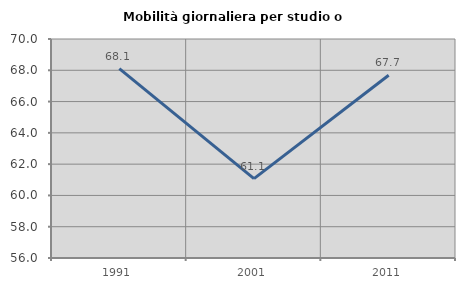
| Category | Mobilità giornaliera per studio o lavoro |
|---|---|
| 1991.0 | 68.109 |
| 2001.0 | 61.074 |
| 2011.0 | 67.685 |